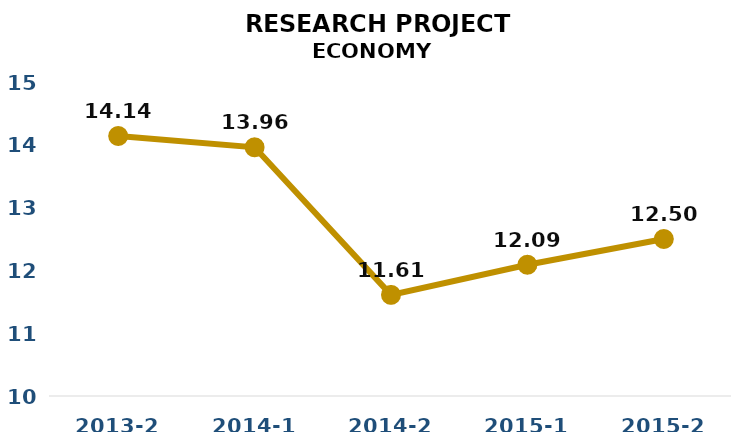
| Category | Series 0 |
|---|---|
| 2013-2 | 14.14 |
| 2014-1 | 13.96 |
| 2014-2 | 11.61 |
| 2015-1 | 12.09 |
| 2015-2 | 12.5 |